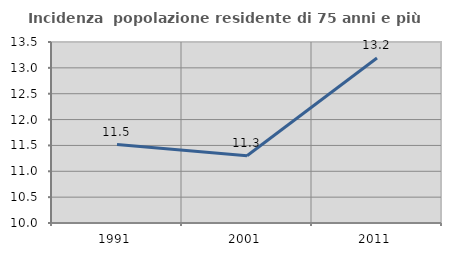
| Category | Incidenza  popolazione residente di 75 anni e più |
|---|---|
| 1991.0 | 11.516 |
| 2001.0 | 11.3 |
| 2011.0 | 13.191 |